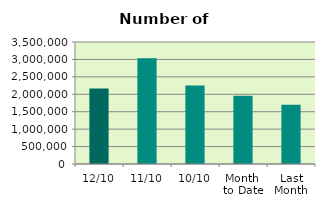
| Category | Series 0 |
|---|---|
| 12/10 | 2163920 |
| 11/10 | 3036512 |
| 10/10 | 2254404 |
| Month 
to Date | 1959199 |
| Last
Month | 1700207.9 |